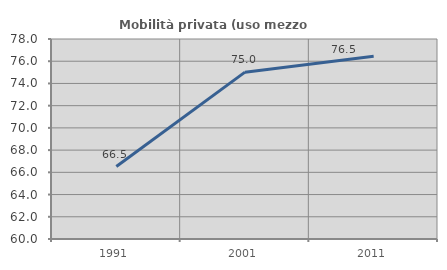
| Category | Mobilità privata (uso mezzo privato) |
|---|---|
| 1991.0 | 66.52 |
| 2001.0 | 75.018 |
| 2011.0 | 76.453 |